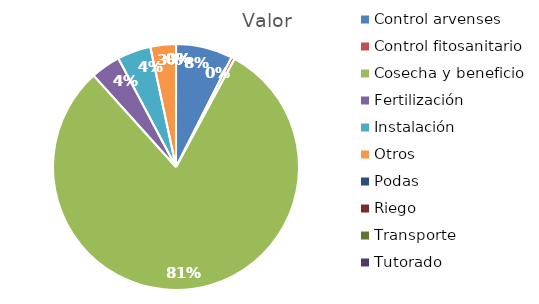
| Category | Valor |
|---|---|
| Control arvenses | 3382063 |
| Control fitosanitario | 196280 |
| Cosecha y beneficio | 36469825 |
| Fertilización | 1766520 |
| Instalación | 2002056 |
| Otros | 1521170 |
| Podas | 0 |
| Riego | 0 |
| Transporte | 0 |
| Tutorado | 0 |